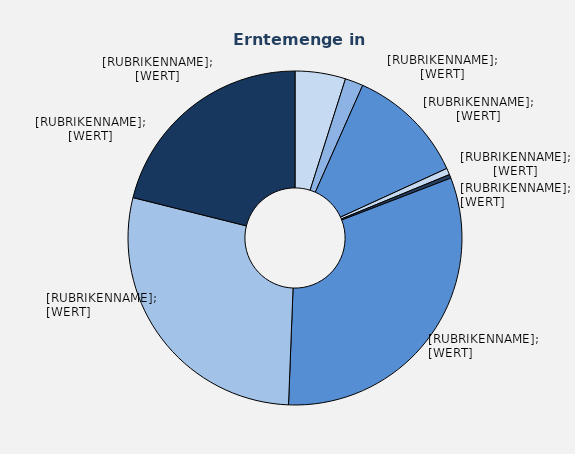
| Category | Series 1 |
|---|---|
| Feldsalat | 69.67 |
| Kopfsalat | 25 |
| sonstige Salate | 164.16 |
| Paprika | 9.03 |
| Radies | 5.12 |
| Salatgurken | 448.28 |
| Tomaten | 402.85 |
| sonstige Gemüsearten | 300.76 |